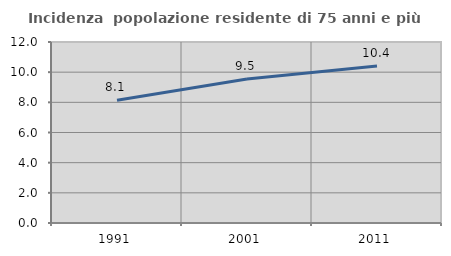
| Category | Incidenza  popolazione residente di 75 anni e più |
|---|---|
| 1991.0 | 8.139 |
| 2001.0 | 9.547 |
| 2011.0 | 10.402 |